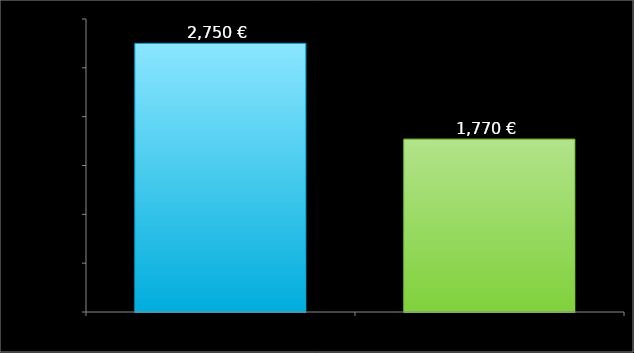
| Category | Données |
|---|---|
| revenu | 2750 |
| dépenses | 1770 |